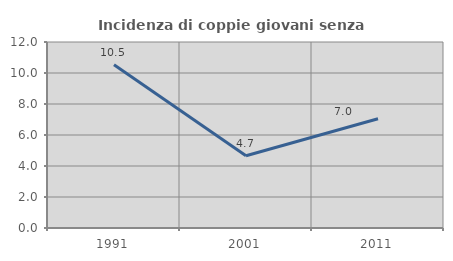
| Category | Incidenza di coppie giovani senza figli |
|---|---|
| 1991.0 | 10.526 |
| 2001.0 | 4.664 |
| 2011.0 | 7.047 |